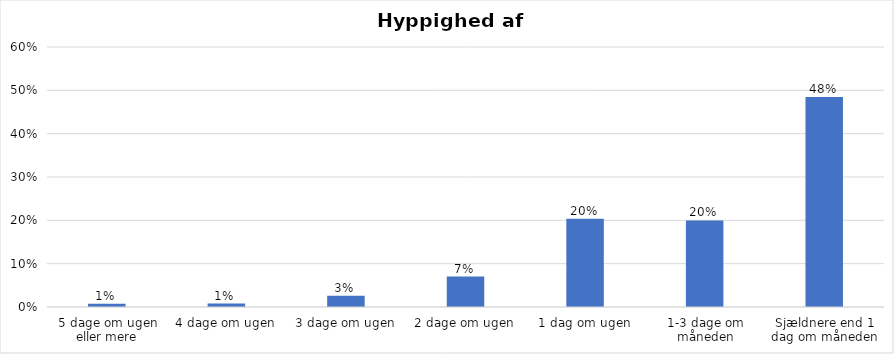
| Category | % |
|---|---|
| 5 dage om ugen eller mere | 0.008 |
| 4 dage om ugen | 0.008 |
| 3 dage om ugen | 0.026 |
| 2 dage om ugen | 0.07 |
| 1 dag om ugen | 0.204 |
| 1-3 dage om måneden | 0.2 |
| Sjældnere end 1 dag om måneden | 0.485 |